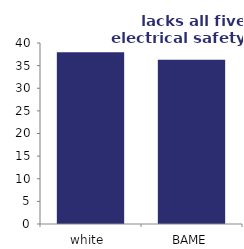
| Category | Series 1 |
|---|---|
| white  | 37.943 |
| BAME | 36.293 |